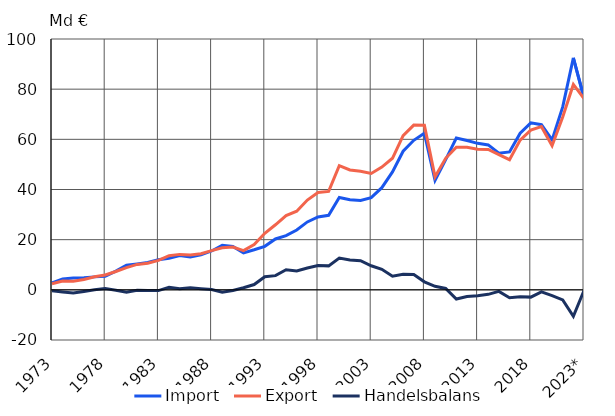
| Category | Import | Export | Handelsbalans |
|---|---|---|---|
| 1973 | 2.792 | 2.456 | -0.336 |
| 1974 | 4.317 | 3.479 | -0.838 |
| 1975 | 4.71 | 3.405 | -1.304 |
| 1976 | 4.803 | 4.121 | -0.681 |
| 1977 | 5.165 | 5.202 | 0.038 |
| 1978 | 5.439 | 5.921 | 0.482 |
| 1979 | 7.438 | 7.304 | -0.133 |
| 1980 | 9.797 | 8.879 | -0.918 |
| 1981 | 10.305 | 10.143 | -0.162 |
| 1982 | 10.89 | 10.6 | -0.29 |
| 1983 | 12.03 | 11.721 | -0.309 |
| 1984 | 12.561 | 13.607 | 1.047 |
| 1985 | 13.711 | 14.132 | 0.422 |
| 1986 | 13.052 | 13.889 | 0.837 |
| 1987 | 13.927 | 14.383 | 0.456 |
| 1988 | 15.493 | 15.625 | 0.132 |
| 1989 | 17.746 | 16.782 | -0.964 |
| 1990 | 17.327 | 17.042 | -0.285 |
| 1991 | 14.757 | 15.615 | 0.857 |
| 1992 | 15.969 | 18.074 | 2.105 |
| 1993 | 17.351 | 22.556 | 5.205 |
| 1994 | 20.274 | 25.928 | 5.654 |
| 1995 | 21.621 | 29.605 | 7.983 |
| 1996 | 23.836 | 31.339 | 7.504 |
| 1997 | 27.077 | 35.797 | 8.72 |
| 1998 | 29.066 | 38.779 | 9.713 |
| 1999 | 29.691 | 39.246 | 9.554 |
| 2000 | 36.837 | 49.484 | 12.647 |
| 2001 | 35.891 | 47.8 | 11.91 |
| 2002 | 35.611 | 47.245 | 11.634 |
| 2003 | 36.775 | 46.378 | 9.604 |
| 2004 | 40.73 | 48.917 | 8.187 |
| 2005 | 47.027 | 52.453 | 5.426 |
| 2006 | 55.253 | 61.489 | 6.237 |
| 2007 | 59.616 | 65.688 | 6.072 |
| 2008 | 62.402 | 65.58 | 3.178 |
| 2009 | 43.655 | 45.063 | 1.409 |
| 2010 | 51.899 | 52.439 | 0.539 |
| 2011 | 60.535 | 56.855 | -3.68 |
| 2012 | 59.517 | 56.878 | -2.639 |
| 2013 | 58.407 | 56.048 | -2.359 |
| 2014 | 57.769 | 55.973 | -1.796 |
| 2015 | 54.493 | 53.88 | -0.613 |
| 2016 | 55.003 | 51.878 | -3.125 |
| 2017 | 62.469 | 59.711 | -2.758 |
| 2018 | 66.585 | 63.682 | -2.903 |
| 2019 | 65.851 | 65.054 | -0.797 |
| 2020 | 59.768 | 57.44 | -2.328 |
| 2021 | 72.936 | 68.908 | -4.027 |
| 2022 | 92.469 | 81.885 | -10.585 |
| 2023* | 76.508 | 76.245 | -0.263 |